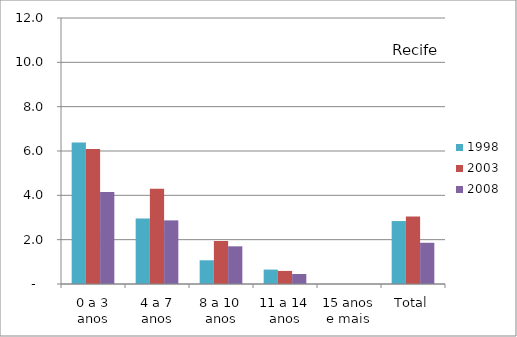
| Category | 1998 | 2003 | 2008 |
|---|---|---|---|
| 0 a 3 anos | 6.38 | 6.09 | 4.15 |
| 4 a 7 anos | 2.95 | 4.3 | 2.87 |
| 8 a 10 anos | 1.07 | 1.94 | 1.7 |
| 11 a 14 anos | 0.65 | 0.59 | 0.45 |
| 15 anos e mais | 0 | 0 | 0 |
| Total | 2.84 | 3.04 | 1.86 |